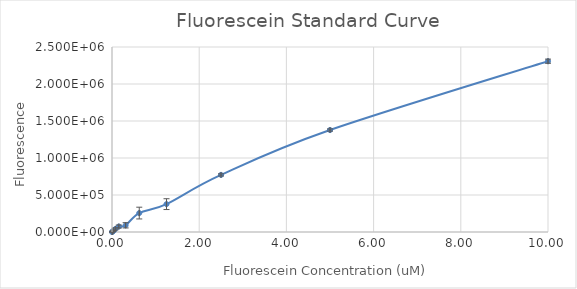
| Category | Series 0 |
|---|---|
| 10.0 | 2308172.75 |
| 5.0 | 1377927.25 |
| 2.5 | 771455 |
| 1.25 | 376569.5 |
| 0.625 | 255756.5 |
| 0.3125 | 90486.5 |
| 0.15625 | 74180.25 |
| 0.078125 | 42378 |
| 0.0390625 | 18808.25 |
| 0.01953125 | 9865.75 |
| 0.009765625 | 5350.75 |
| 0.0 | 0 |